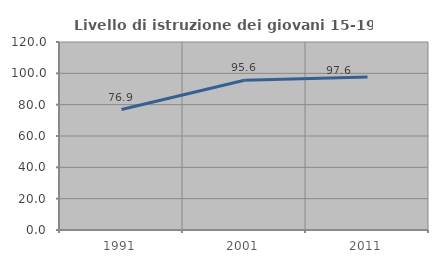
| Category | Livello di istruzione dei giovani 15-19 anni |
|---|---|
| 1991.0 | 76.909 |
| 2001.0 | 95.616 |
| 2011.0 | 97.635 |